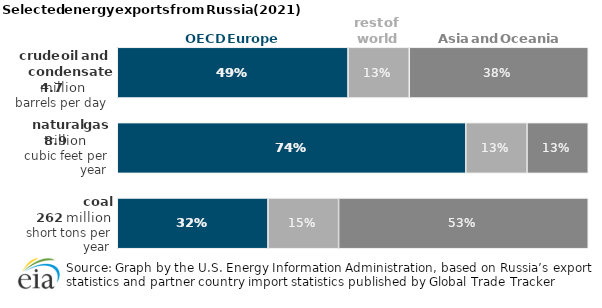
| Category | OECD Europe | rest of world | Asia and Oceania |
|---|---|---|---|
| coal | 0.32 | 0.15 | 0.53 |
| natural gas | 0.74 | 0.13 | 0.13 |
| crude oil and condensate | 0.49 | 0.13 | 0.38 |